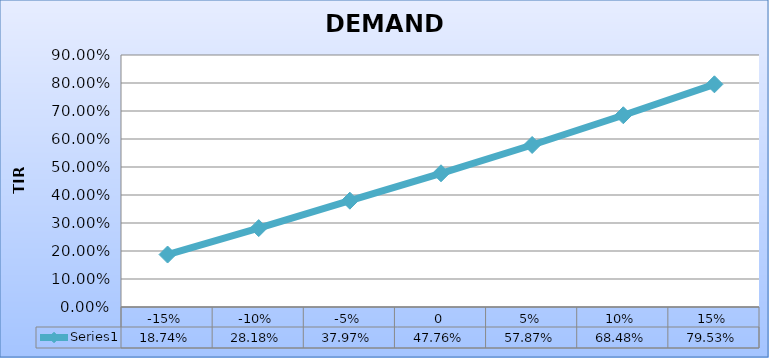
| Category | Series 0 |
|---|---|
| -0.15 | 0.187 |
| -0.1 | 0.282 |
| -0.05 | 0.38 |
| 0.0 | 0.478 |
| 0.05 | 0.579 |
| 0.1 | 0.685 |
| 0.15 | 0.795 |